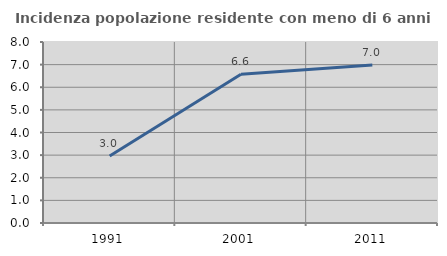
| Category | Incidenza popolazione residente con meno di 6 anni |
|---|---|
| 1991.0 | 2.963 |
| 2001.0 | 6.576 |
| 2011.0 | 6.982 |